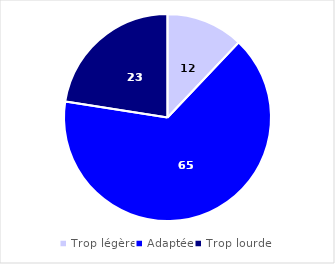
| Category | Series 0 |
|---|---|
| Trop légère | 12.08 |
| Adaptée | 65.4 |
| Trop lourde | 22.52 |